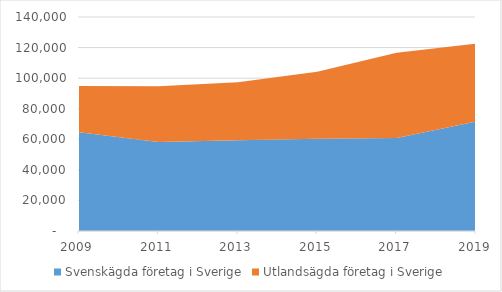
| Category | Svenskägda företag i Sverige | Utlandsägda företag i Sverige |
|---|---|---|
| 2009.0 | 64582.596 | 30238.748 |
| 2011.0 | 58301.806 | 36469 |
| 2013.0 | 59369.28 | 37981.136 |
| 2015.0 | 60341.635 | 43864.548 |
| 2017.0 | 60800.039 | 55842.436 |
| 2019.0 | 71582.438 | 51068.851 |